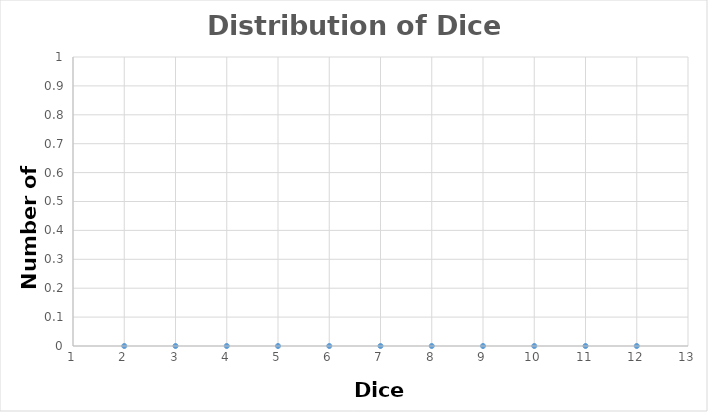
| Category | Series 0 |
|---|---|
| 2.0 | 0 |
| 3.0 | 0 |
| 4.0 | 0 |
| 5.0 | 0 |
| 6.0 | 0 |
| 7.0 | 0 |
| 8.0 | 0 |
| 9.0 | 0 |
| 10.0 | 0 |
| 11.0 | 0 |
| 12.0 | 0 |